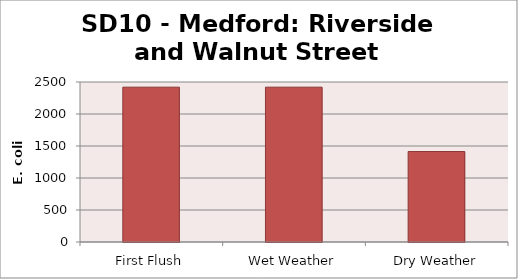
| Category | E. coli MPN |
|---|---|
| First Flush | 2419.2 |
| Wet Weather | 2419.2 |
| Dry Weather | 1413.6 |